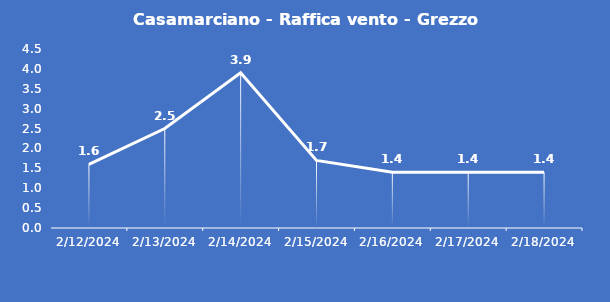
| Category | Casamarciano - Raffica vento - Grezzo (m/s) |
|---|---|
| 2/12/24 | 1.6 |
| 2/13/24 | 2.5 |
| 2/14/24 | 3.9 |
| 2/15/24 | 1.7 |
| 2/16/24 | 1.4 |
| 2/17/24 | 1.4 |
| 2/18/24 | 1.4 |